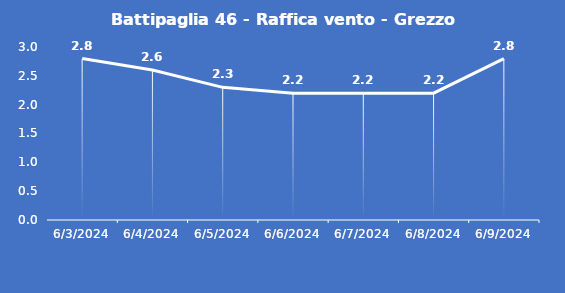
| Category | Battipaglia 46 - Raffica vento - Grezzo (m/s) |
|---|---|
| 6/3/24 | 2.8 |
| 6/4/24 | 2.6 |
| 6/5/24 | 2.3 |
| 6/6/24 | 2.2 |
| 6/7/24 | 2.2 |
| 6/8/24 | 2.2 |
| 6/9/24 | 2.8 |